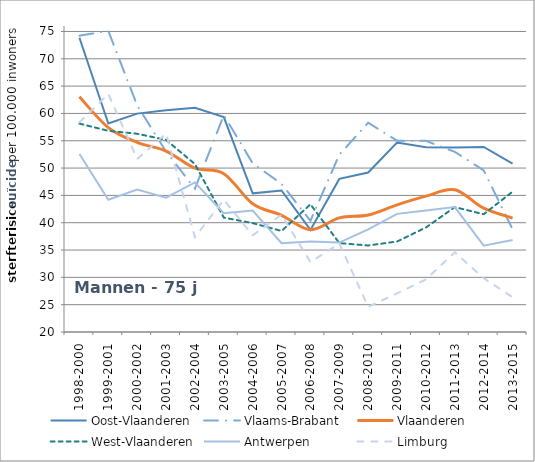
| Category | Oost-Vlaanderen | Vlaams-Brabant | Vlaanderen | West-Vlaanderen | Antwerpen | Limburg |
|---|---|---|---|---|---|---|
| 1998-2000 | 73.848 | 74.231 | 63.047 | 58.134 | 52.566 | 58.381 |
| 1999-2001 | 58.155 | 75.102 | 57.412 | 56.817 | 44.208 | 63.56 |
| 2000-2002 | 59.967 | 61.459 | 54.701 | 56.281 | 46.086 | 51.668 |
| 2001-2003 | 60.583 | 53.024 | 53.115 | 55.149 | 44.593 | 56.285 |
| 2002-2004 | 61.052 | 46.237 | 49.98 | 50.733 | 47.37 | 37.368 |
| 2003-2005 | 59.315 | 59.685 | 48.976 | 40.936 | 41.754 | 44.192 |
| 2004-2006 | 45.375 | 50.877 | 43.463 | 39.925 | 42.237 | 37.703 |
| 2005-2007 | 45.9 | 47.099 | 41.359 | 38.488 | 36.24 | 41.46 |
| 2006-2008 | 38.683 | 40.341 | 38.712 | 43.371 | 36.58 | 32.8 |
| 2007-2009 | 48.02 | 52.455 | 40.879 | 36.266 | 36.368 | 36.176 |
| 2008-2010 | 49.18 | 58.296 | 41.405 | 35.835 | 38.791 | 24.609 |
| 2009-2011 | 54.667 | 55.011 | 43.276 | 36.561 | 41.62 | 27.072 |
| 2010-2012 | 53.801 | 54.98 | 44.861 | 39.122 | 42.222 | 29.624 |
| 2011-2013 | 53.777 | 52.97 | 46.032 | 42.856 | 42.867 | 34.593 |
| 2012-2014 | 53.871 | 49.581 | 42.659 | 41.554 | 35.796 | 29.852 |
| 2013-2015 | 50.827 | 38.803 | 40.849 | 45.682 | 36.826 | 26.36 |